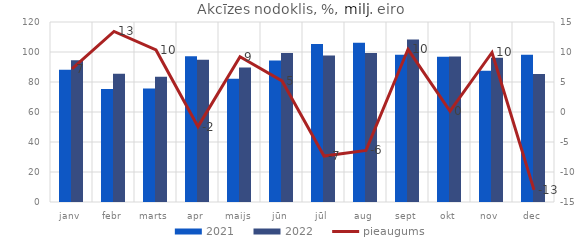
| Category | 2021 | 2022 |
|---|---|---|
| janv | 88.146 | 94.49 |
| febr | 75.317 | 85.432 |
| marts | 75.64 | 83.467 |
| apr | 97.13 | 94.762 |
| maijs | 82.14 | 89.709 |
| jūn | 94.392 | 99.296 |
| jūl | 105.342 | 97.607 |
| aug | 106.115 | 99.32 |
| sept | 98.114 | 108.37 |
| okt | 96.822 | 96.951 |
| nov | 87.559 | 96.244 |
| dec | 98.123 | 85.386 |